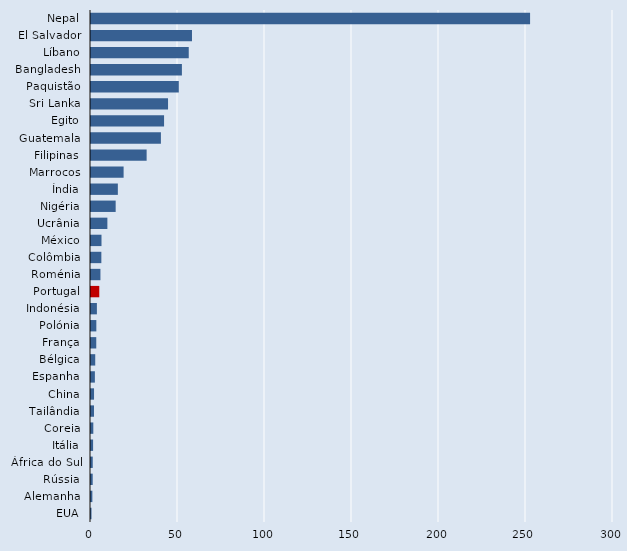
| Category | Series 2 |
|---|---|
| Nepal | 252.346 |
| El Salvador | 58.038 |
| Líbano | 56.179 |
| Bangladesh | 52.242 |
| Paquistão | 50.451 |
| Sri Lanka | 44.276 |
| Egito | 41.993 |
| Guatemala | 40.174 |
| Filipinas | 31.973 |
| Marrocos | 18.74 |
| Índia | 15.43 |
| Nigéria | 14.176 |
| Ucrânia | 9.412 |
| México | 6.033 |
| Colômbia | 5.952 |
| Roménia | 5.423 |
| Portugal | 4.756 |
| Indonésia | 3.386 |
| Polónia | 3.068 |
| França | 3.026 |
| Bélgica | 2.434 |
| Espanha | 2.231 |
| China | 1.744 |
| Tailândia | 1.718 |
| Coreia | 1.328 |
| Itália | 1.204 |
| África do Sul | 0.999 |
| Rússia | 0.976 |
| Alemanha | 0.787 |
| EUA | 0.286 |